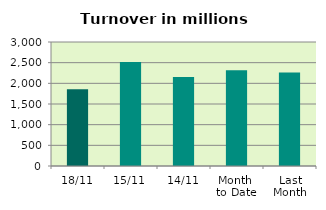
| Category | Series 0 |
|---|---|
| 18/11 | 1859.296 |
| 15/11 | 2515.666 |
| 14/11 | 2156.064 |
| Month 
to Date | 2319.36 |
| Last
Month | 2263.558 |